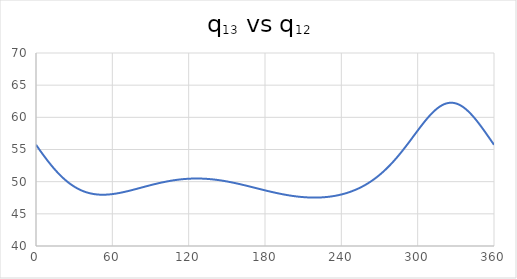
| Category | Series 0 |
|---|---|
| 0.0 | 55.738 |
| 1.0 | 55.455 |
| 2.0 | 55.174 |
| 3.0 | 54.895 |
| 4.0 | 54.619 |
| 5.0 | 54.346 |
| 6.0 | 54.076 |
| 7.0 | 53.809 |
| 8.0 | 53.547 |
| 9.0 | 53.289 |
| 10.0 | 53.036 |
| 11.0 | 52.788 |
| 12.0 | 52.545 |
| 13.0 | 52.307 |
| 14.0 | 52.075 |
| 15.0 | 51.849 |
| 16.0 | 51.629 |
| 17.0 | 51.415 |
| 18.0 | 51.208 |
| 19.0 | 51.006 |
| 20.0 | 50.812 |
| 21.0 | 50.624 |
| 22.0 | 50.443 |
| 23.0 | 50.268 |
| 24.0 | 50.101 |
| 25.0 | 49.94 |
| 26.0 | 49.786 |
| 27.0 | 49.639 |
| 28.0 | 49.498 |
| 29.0 | 49.365 |
| 30.0 | 49.238 |
| 31.0 | 49.118 |
| 32.0 | 49.004 |
| 33.0 | 48.897 |
| 34.0 | 48.797 |
| 35.0 | 48.703 |
| 36.0 | 48.615 |
| 37.0 | 48.534 |
| 38.0 | 48.458 |
| 39.0 | 48.389 |
| 40.0 | 48.325 |
| 41.0 | 48.268 |
| 42.0 | 48.216 |
| 43.0 | 48.169 |
| 44.0 | 48.127 |
| 45.0 | 48.091 |
| 46.0 | 48.06 |
| 47.0 | 48.034 |
| 48.0 | 48.012 |
| 49.0 | 47.995 |
| 50.0 | 47.983 |
| 51.0 | 47.975 |
| 52.0 | 47.971 |
| 53.0 | 47.971 |
| 54.0 | 47.975 |
| 55.0 | 47.982 |
| 56.0 | 47.993 |
| 57.0 | 48.007 |
| 58.0 | 48.025 |
| 59.0 | 48.045 |
| 60.0 | 48.069 |
| 61.0 | 48.095 |
| 62.0 | 48.124 |
| 63.0 | 48.155 |
| 64.0 | 48.188 |
| 65.0 | 48.224 |
| 66.0 | 48.262 |
| 67.0 | 48.301 |
| 68.0 | 48.343 |
| 69.0 | 48.386 |
| 70.0 | 48.43 |
| 71.0 | 48.476 |
| 72.0 | 48.523 |
| 73.0 | 48.571 |
| 74.0 | 48.62 |
| 75.0 | 48.67 |
| 76.0 | 48.721 |
| 77.0 | 48.772 |
| 78.0 | 48.824 |
| 79.0 | 48.877 |
| 80.0 | 48.929 |
| 81.0 | 48.982 |
| 82.0 | 49.035 |
| 83.0 | 49.088 |
| 84.0 | 49.141 |
| 85.0 | 49.194 |
| 86.0 | 49.247 |
| 87.0 | 49.299 |
| 88.0 | 49.351 |
| 89.0 | 49.402 |
| 90.0 | 49.453 |
| 91.0 | 49.503 |
| 92.0 | 49.553 |
| 93.0 | 49.602 |
| 94.0 | 49.65 |
| 95.0 | 49.697 |
| 96.0 | 49.743 |
| 97.0 | 49.788 |
| 98.0 | 49.832 |
| 99.0 | 49.875 |
| 100.0 | 49.917 |
| 101.0 | 49.958 |
| 102.0 | 49.997 |
| 103.0 | 50.036 |
| 104.0 | 50.072 |
| 105.0 | 50.108 |
| 106.0 | 50.142 |
| 107.0 | 50.174 |
| 108.0 | 50.205 |
| 109.0 | 50.235 |
| 110.0 | 50.263 |
| 111.0 | 50.29 |
| 112.0 | 50.315 |
| 113.0 | 50.338 |
| 114.0 | 50.36 |
| 115.0 | 50.38 |
| 116.0 | 50.398 |
| 117.0 | 50.415 |
| 118.0 | 50.43 |
| 119.0 | 50.443 |
| 120.0 | 50.455 |
| 121.0 | 50.465 |
| 122.0 | 50.473 |
| 123.0 | 50.48 |
| 124.0 | 50.485 |
| 125.0 | 50.488 |
| 126.0 | 50.489 |
| 127.0 | 50.489 |
| 128.0 | 50.486 |
| 129.0 | 50.483 |
| 130.0 | 50.477 |
| 131.0 | 50.47 |
| 132.0 | 50.461 |
| 133.0 | 50.451 |
| 134.0 | 50.438 |
| 135.0 | 50.424 |
| 136.0 | 50.409 |
| 137.0 | 50.392 |
| 138.0 | 50.373 |
| 139.0 | 50.353 |
| 140.0 | 50.331 |
| 141.0 | 50.308 |
| 142.0 | 50.283 |
| 143.0 | 50.257 |
| 144.0 | 50.23 |
| 145.0 | 50.201 |
| 146.0 | 50.17 |
| 147.0 | 50.138 |
| 148.0 | 50.106 |
| 149.0 | 50.071 |
| 150.0 | 50.036 |
| 151.0 | 49.999 |
| 152.0 | 49.962 |
| 153.0 | 49.923 |
| 154.0 | 49.883 |
| 155.0 | 49.842 |
| 156.0 | 49.8 |
| 157.0 | 49.758 |
| 158.0 | 49.714 |
| 159.0 | 49.67 |
| 160.0 | 49.625 |
| 161.0 | 49.579 |
| 162.0 | 49.533 |
| 163.0 | 49.486 |
| 164.0 | 49.438 |
| 165.0 | 49.391 |
| 166.0 | 49.342 |
| 167.0 | 49.293 |
| 168.0 | 49.244 |
| 169.0 | 49.195 |
| 170.0 | 49.145 |
| 171.0 | 49.096 |
| 172.0 | 49.046 |
| 173.0 | 48.996 |
| 174.0 | 48.946 |
| 175.0 | 48.897 |
| 176.0 | 48.847 |
| 177.0 | 48.798 |
| 178.0 | 48.749 |
| 179.0 | 48.7 |
| 180.0 | 48.651 |
| 181.0 | 48.603 |
| 182.0 | 48.556 |
| 183.0 | 48.509 |
| 184.0 | 48.462 |
| 185.0 | 48.416 |
| 186.0 | 48.371 |
| 187.0 | 48.327 |
| 188.0 | 48.283 |
| 189.0 | 48.24 |
| 190.0 | 48.198 |
| 191.0 | 48.157 |
| 192.0 | 48.117 |
| 193.0 | 48.077 |
| 194.0 | 48.039 |
| 195.0 | 48.002 |
| 196.0 | 47.966 |
| 197.0 | 47.931 |
| 198.0 | 47.898 |
| 199.0 | 47.865 |
| 200.0 | 47.834 |
| 201.0 | 47.804 |
| 202.0 | 47.776 |
| 203.0 | 47.749 |
| 204.0 | 47.723 |
| 205.0 | 47.699 |
| 206.0 | 47.676 |
| 207.0 | 47.654 |
| 208.0 | 47.635 |
| 209.0 | 47.616 |
| 210.0 | 47.6 |
| 211.0 | 47.585 |
| 212.0 | 47.571 |
| 213.0 | 47.56 |
| 214.0 | 47.55 |
| 215.0 | 47.542 |
| 216.0 | 47.535 |
| 217.0 | 47.531 |
| 218.0 | 47.528 |
| 219.0 | 47.527 |
| 220.0 | 47.528 |
| 221.0 | 47.531 |
| 222.0 | 47.536 |
| 223.0 | 47.543 |
| 224.0 | 47.552 |
| 225.0 | 47.563 |
| 226.0 | 47.577 |
| 227.0 | 47.592 |
| 228.0 | 47.61 |
| 229.0 | 47.629 |
| 230.0 | 47.651 |
| 231.0 | 47.676 |
| 232.0 | 47.703 |
| 233.0 | 47.732 |
| 234.0 | 47.763 |
| 235.0 | 47.797 |
| 236.0 | 47.834 |
| 237.0 | 47.873 |
| 238.0 | 47.915 |
| 239.0 | 47.96 |
| 240.0 | 48.007 |
| 241.0 | 48.057 |
| 242.0 | 48.11 |
| 243.0 | 48.166 |
| 244.0 | 48.225 |
| 245.0 | 48.287 |
| 246.0 | 48.352 |
| 247.0 | 48.421 |
| 248.0 | 48.492 |
| 249.0 | 48.567 |
| 250.0 | 48.646 |
| 251.0 | 48.727 |
| 252.0 | 48.813 |
| 253.0 | 48.902 |
| 254.0 | 48.994 |
| 255.0 | 49.091 |
| 256.0 | 49.191 |
| 257.0 | 49.295 |
| 258.0 | 49.403 |
| 259.0 | 49.516 |
| 260.0 | 49.632 |
| 261.0 | 49.753 |
| 262.0 | 49.878 |
| 263.0 | 50.007 |
| 264.0 | 50.141 |
| 265.0 | 50.28 |
| 266.0 | 50.423 |
| 267.0 | 50.571 |
| 268.0 | 50.723 |
| 269.0 | 50.881 |
| 270.0 | 51.043 |
| 271.0 | 51.21 |
| 272.0 | 51.382 |
| 273.0 | 51.559 |
| 274.0 | 51.741 |
| 275.0 | 51.928 |
| 276.0 | 52.12 |
| 277.0 | 52.317 |
| 278.0 | 52.519 |
| 279.0 | 52.726 |
| 280.0 | 52.938 |
| 281.0 | 53.155 |
| 282.0 | 53.377 |
| 283.0 | 53.603 |
| 284.0 | 53.833 |
| 285.0 | 54.068 |
| 286.0 | 54.308 |
| 287.0 | 54.551 |
| 288.0 | 54.798 |
| 289.0 | 55.049 |
| 290.0 | 55.302 |
| 291.0 | 55.559 |
| 292.0 | 55.819 |
| 293.0 | 56.08 |
| 294.0 | 56.344 |
| 295.0 | 56.609 |
| 296.0 | 56.875 |
| 297.0 | 57.141 |
| 298.0 | 57.407 |
| 299.0 | 57.673 |
| 300.0 | 57.938 |
| 301.0 | 58.201 |
| 302.0 | 58.461 |
| 303.0 | 58.719 |
| 304.0 | 58.972 |
| 305.0 | 59.222 |
| 306.0 | 59.466 |
| 307.0 | 59.705 |
| 308.0 | 59.937 |
| 309.0 | 60.161 |
| 310.0 | 60.378 |
| 311.0 | 60.587 |
| 312.0 | 60.785 |
| 313.0 | 60.974 |
| 314.0 | 61.153 |
| 315.0 | 61.32 |
| 316.0 | 61.475 |
| 317.0 | 61.617 |
| 318.0 | 61.747 |
| 319.0 | 61.863 |
| 320.0 | 61.965 |
| 321.0 | 62.053 |
| 322.0 | 62.126 |
| 323.0 | 62.185 |
| 324.0 | 62.228 |
| 325.0 | 62.256 |
| 326.0 | 62.268 |
| 327.0 | 62.265 |
| 328.0 | 62.246 |
| 329.0 | 62.212 |
| 330.0 | 62.163 |
| 331.0 | 62.099 |
| 332.0 | 62.019 |
| 333.0 | 61.925 |
| 334.0 | 61.817 |
| 335.0 | 61.695 |
| 336.0 | 61.559 |
| 337.0 | 61.41 |
| 338.0 | 61.249 |
| 339.0 | 61.075 |
| 340.0 | 60.89 |
| 341.0 | 60.695 |
| 342.0 | 60.488 |
| 343.0 | 60.273 |
| 344.0 | 60.048 |
| 345.0 | 59.814 |
| 346.0 | 59.573 |
| 347.0 | 59.325 |
| 348.0 | 59.07 |
| 349.0 | 58.809 |
| 350.0 | 58.543 |
| 351.0 | 58.273 |
| 352.0 | 57.999 |
| 353.0 | 57.721 |
| 354.0 | 57.441 |
| 355.0 | 57.159 |
| 356.0 | 56.876 |
| 357.0 | 56.591 |
| 358.0 | 56.306 |
| 359.0 | 56.022 |
| 360.0 | 55.738 |